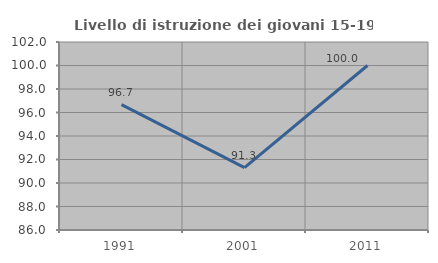
| Category | Livello di istruzione dei giovani 15-19 anni |
|---|---|
| 1991.0 | 96.667 |
| 2001.0 | 91.304 |
| 2011.0 | 100 |